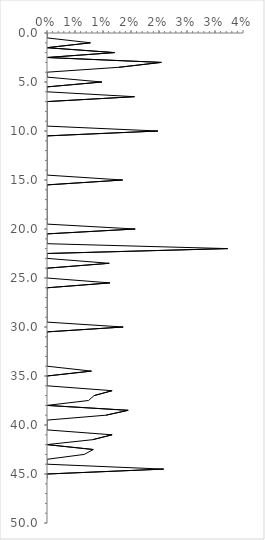
| Category | Series 0 |
|---|---|
| 0.0 | 0 |
| 0.0 | 0.5 |
| 0.007751937984496124 | 1 |
| 0.0 | 1.5 |
| 0.012048192771084338 | 2 |
| 0.0 | 2.5 |
| 0.02040816326530612 | 3 |
| 0.01282051282051282 | 3.5 |
| 0.0 | 4 |
| 0.0 | 4.5 |
| 0.00980392156862745 | 5 |
| 0.0 | 5.5 |
| 0.0 | 6 |
| 0.015625 | 6.5 |
| 0.0 | 7 |
| 0.0 | 7.5 |
| 0.0 | 8 |
| 0.0 | 8.5 |
| 0.0 | 9 |
| 0.0 | 9.5 |
| 0.019801980198019802 | 10 |
| 0.0 | 10.5 |
| 0.0 | 11 |
| 0.0 | 11.5 |
| 0.0 | 12 |
| 0.0 | 12.5 |
| 0.0 | 13 |
| 0.0 | 13.5 |
| 0.0 | 14 |
| 0.0 | 14.5 |
| 0.013513513513513514 | 15 |
| 0.0 | 15.5 |
| 0.0 | 16 |
| 0.0 | 16.5 |
| 0.0 | 17 |
| 0.0 | 17.5 |
| 0.0 | 18 |
| 0.0 | 18.5 |
| 0.0 | 19 |
| 0.0 | 19.5 |
| 0.015748031496062992 | 20 |
| 0.0 | 20.5 |
| 0.0 | 21 |
| 0.0 | 21.5 |
| 0.03225806451612903 | 22 |
| 0.0 | 22.5 |
| 0.0 | 23 |
| 0.011111111111111112 | 23.5 |
| 0.0 | 24 |
| 0.0 | 24.5 |
| 0.0 | 25 |
| 0.011235955056179775 | 25.5 |
| 0.0 | 26 |
| 0.0 | 26.5 |
| 0.0 | 27 |
| 0.0 | 27.5 |
| 0.0 | 28 |
| 0.0 | 28.5 |
| 0.0 | 29 |
| 0.0 | 29.5 |
| 0.013605442176870748 | 30 |
| 0.0 | 30.5 |
| 0.0 | 31 |
| 0.0 | 31.5 |
| 0.0 | 32 |
| 0.0 | 32.5 |
| 0.0 | 33 |
| 0.0 | 33.5 |
| 0.0 | 34 |
| 0.007936507936507936 | 34.5 |
| 0.0 | 35 |
| 0.0 | 35.5 |
| 0.0 | 36 |
| 0.011627906976744186 | 36.5 |
| 0.008403361344537815 | 37 |
| 0.007407407407407408 | 37.5 |
| 0.0 | 38 |
| 0.014492753623188406 | 38.5 |
| 0.010526315789473684 | 39 |
| 0.0 | 39.5 |
| 0.0 | 40 |
| 0.0 | 40.5 |
| 0.011627906976744186 | 41 |
| 0.008130081300813009 | 41.5 |
| 0.0 | 42 |
| 0.008264462809917356 | 42.5 |
| 0.006666666666666667 | 43 |
| 0.0 | 43.5 |
| 0.0 | 44 |
| 0.020833333333333332 | 44.5 |
| 0.0 | 45 |
| 0.0 | 45.5 |